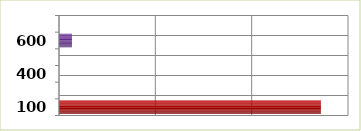
| Category | Series 0 |
|---|---|
| 100.0 | 5437668 |
| 200.0 | 0 |
| 400.0 | 0 |
| 500.0 | 0 |
| 600.0 | 268532 |
| 700.0 | 0 |